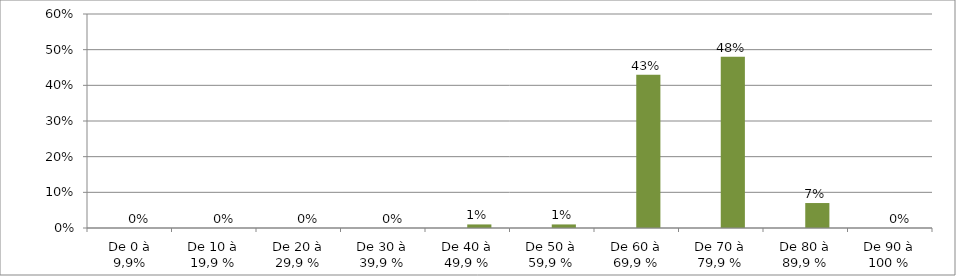
| Category | Series 0 | Series 1 |
|---|---|---|
| De 0 à 9,9% |  | 0 |
| De 10 à 19,9 % |  | 0 |
| De 20 à 29,9 % |  | 0 |
| De 30 à 39,9 % |  | 0 |
| De 40 à 49,9 % |  | 0.01 |
| De 50 à 59,9 % |  | 0.01 |
| De 60 à 69,9 % |  | 0.43 |
| De 70 à 79,9 % |  | 0.48 |
| De 80 à 89,9 % |  | 0.07 |
| De 90 à 100 % |  | 0 |